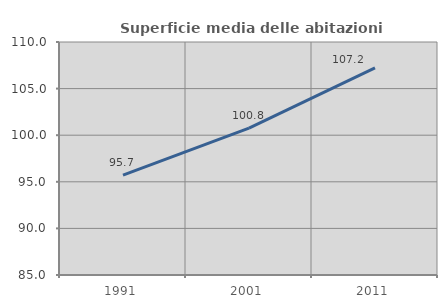
| Category | Superficie media delle abitazioni occupate |
|---|---|
| 1991.0 | 95.707 |
| 2001.0 | 100.763 |
| 2011.0 | 107.22 |